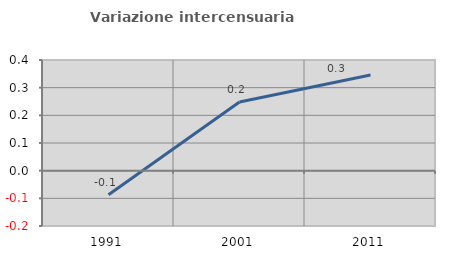
| Category | Variazione intercensuaria annua |
|---|---|
| 1991.0 | -0.087 |
| 2001.0 | 0.248 |
| 2011.0 | 0.346 |